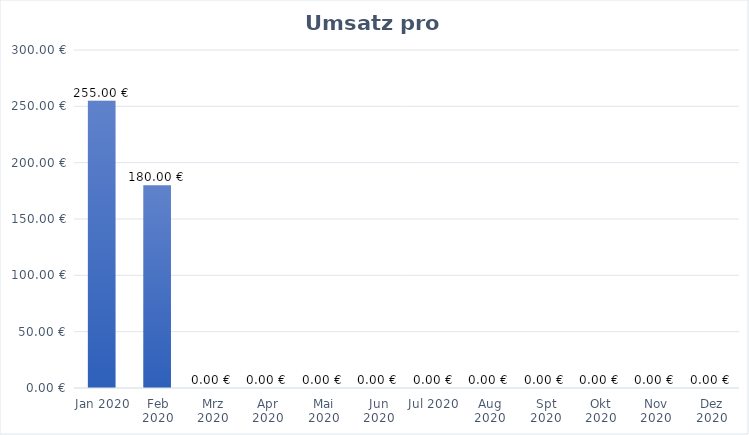
| Category | Series 0 |
|---|---|
| Jan 2020 | 255 |
| Feb 2020 | 180 |
| Mrz 2020 | 0 |
| Apr 2020 | 0 |
| Mai 2020 | 0 |
| Jun 2020 | 0 |
| Jul 2020 | 0 |
| Aug 2020 | 0 |
| Spt 2020 | 0 |
| Okt 2020 | 0 |
| Nov 2020 | 0 |
| Dez 2020 | 0 |